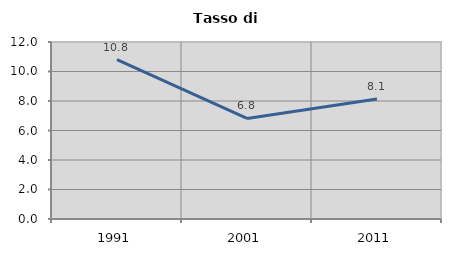
| Category | Tasso di disoccupazione   |
|---|---|
| 1991.0 | 10.799 |
| 2001.0 | 6.818 |
| 2011.0 | 8.131 |